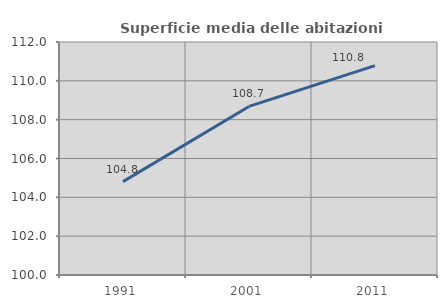
| Category | Superficie media delle abitazioni occupate |
|---|---|
| 1991.0 | 104.809 |
| 2001.0 | 108.682 |
| 2011.0 | 110.78 |